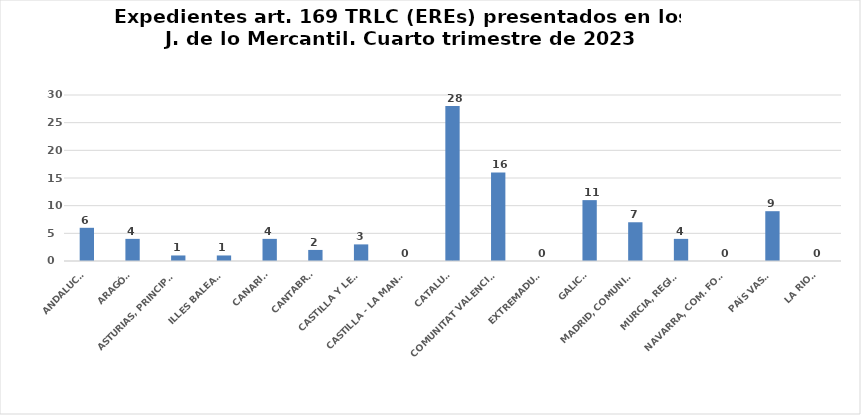
| Category | Series 0 |
|---|---|
| ANDALUCÍA | 6 |
| ARAGÓN | 4 |
| ASTURIAS, PRINCIPADO | 1 |
| ILLES BALEARS | 1 |
| CANARIAS | 4 |
| CANTABRIA | 2 |
| CASTILLA Y LEÓN | 3 |
| CASTILLA - LA MANCHA | 0 |
| CATALUÑA | 28 |
| COMUNITAT VALENCIANA | 16 |
| EXTREMADURA | 0 |
| GALICIA | 11 |
| MADRID, COMUNIDAD | 7 |
| MURCIA, REGIÓN | 4 |
| NAVARRA, COM. FORAL | 0 |
| PAÍS VASCO | 9 |
| LA RIOJA | 0 |